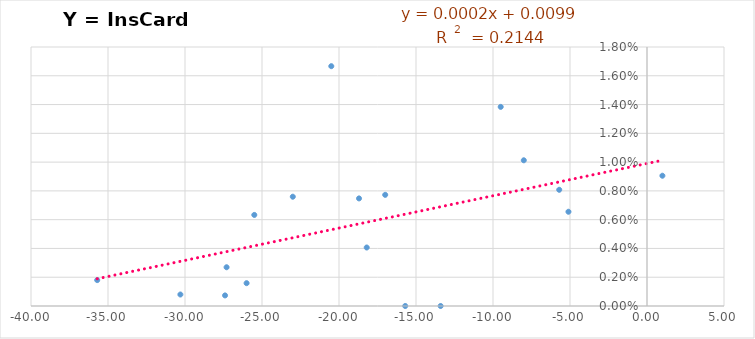
| Category | Y = InsCard /año |
|---|---|
| -30.30000000000001 | 0.001 |
| -23.0 | 0.008 |
| -8.0 | 0.01 |
| -35.69999999999999 | 0.002 |
| -27.30000000000001 | 0.003 |
| -18.69999999999999 | 0.007 |
| -20.5 | 0.017 |
| -18.19999999999999 | 0.004 |
| -15.699999999999989 | 0 |
| -27.400000000000006 | 0.001 |
| -17.0 | 0.008 |
| 1.0 | 0.009 |
| -26.0 | 0.002 |
| -25.5 | 0.006 |
| -5.699999999999989 | 0.008 |
| -9.5 | 0.014 |
| -5.099999999999994 | 0.007 |
| -13.400000000000006 | 0 |